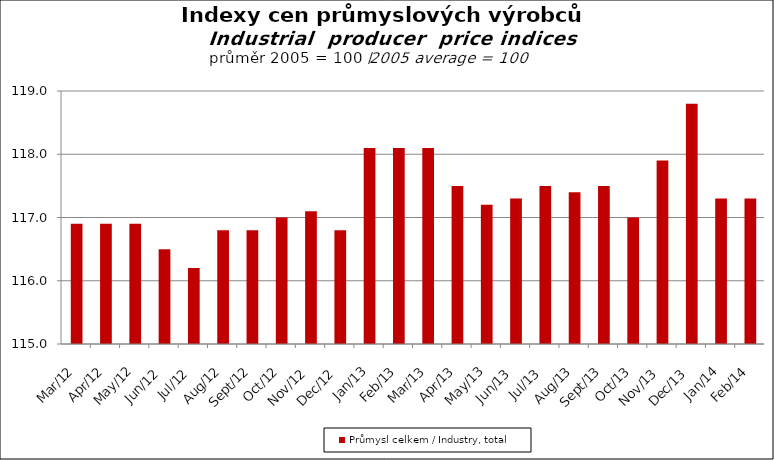
| Category | Průmysl celkem / Industry, total |
|---|---|
| 2012-03-01 | 116.9 |
| 2012-04-01 | 116.9 |
| 2012-05-01 | 116.9 |
| 2012-06-01 | 116.5 |
| 2012-07-01 | 116.2 |
| 2012-08-01 | 116.8 |
| 2012-09-01 | 116.8 |
| 2012-10-01 | 117 |
| 2012-11-01 | 117.1 |
| 2012-12-01 | 116.8 |
| 2013-01-01 | 118.1 |
| 2013-02-01 | 118.1 |
| 2013-03-01 | 118.1 |
| 2013-04-01 | 117.5 |
| 2013-05-01 | 117.2 |
| 2013-06-01 | 117.3 |
| 2013-07-01 | 117.5 |
| 2013-08-01 | 117.4 |
| 2013-09-01 | 117.5 |
| 2013-10-01 | 117 |
| 2013-11-01 | 117.9 |
| 2013-12-01 | 118.8 |
| 2014-01-01 | 117.3 |
| 2014-02-01 | 117.3 |